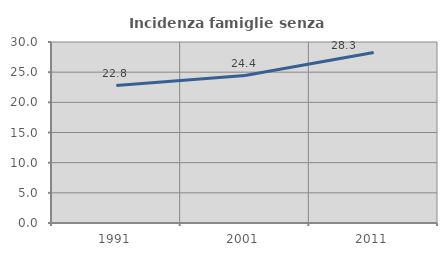
| Category | Incidenza famiglie senza nuclei |
|---|---|
| 1991.0 | 22.772 |
| 2001.0 | 24.438 |
| 2011.0 | 28.272 |